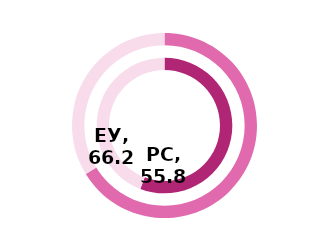
| Category | РС | Series 1 | ЕУ |
|---|---|---|---|
| Index | 55.8 |  | 66.2 |
| Rest | 44.2 |  | 33.8 |